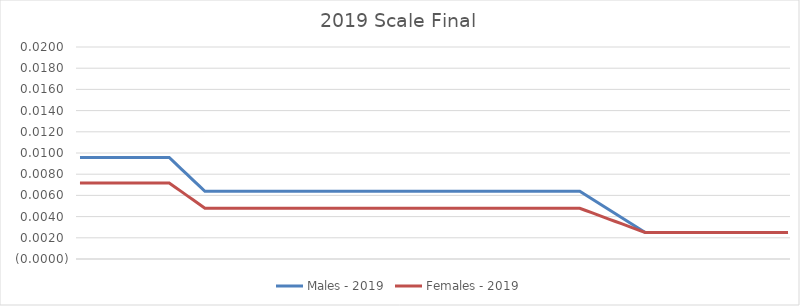
| Category |  Males - 2019  |  Females - 2019  |
|---|---|---|
|  | 0.01 | 0.007 |
|  | 0.01 | 0.007 |
|  | 0.01 | 0.007 |
|  | 0.01 | 0.007 |
|  | 0.01 | 0.007 |
|  | 0.01 | 0.007 |
|  | 0.01 | 0.007 |
|  | 0.01 | 0.007 |
|  | 0.01 | 0.007 |
|  | 0.01 | 0.007 |
|  | 0.01 | 0.007 |
|  | 0.01 | 0.007 |
|  | 0.01 | 0.007 |
|  | 0.01 | 0.007 |
|  | 0.01 | 0.007 |
|  | 0.01 | 0.007 |
|  | 0.009 | 0.007 |
|  | 0.009 | 0.006 |
|  | 0.008 | 0.006 |
|  | 0.007 | 0.006 |
|  | 0.007 | 0.005 |
|  | 0.006 | 0.005 |
|  | 0.006 | 0.005 |
|  | 0.006 | 0.005 |
|  | 0.006 | 0.005 |
|  | 0.006 | 0.005 |
|  | 0.006 | 0.005 |
|  | 0.006 | 0.005 |
|  | 0.006 | 0.005 |
|  | 0.006 | 0.005 |
|  | 0.006 | 0.005 |
|  | 0.006 | 0.005 |
|  | 0.006 | 0.005 |
|  | 0.006 | 0.005 |
|  | 0.006 | 0.005 |
|  | 0.006 | 0.005 |
|  | 0.006 | 0.005 |
|  | 0.006 | 0.005 |
|  | 0.006 | 0.005 |
|  | 0.006 | 0.005 |
|  | 0.006 | 0.005 |
|  | 0.006 | 0.005 |
|  | 0.006 | 0.005 |
|  | 0.006 | 0.005 |
|  | 0.006 | 0.005 |
|  | 0.006 | 0.005 |
|  | 0.006 | 0.005 |
|  | 0.006 | 0.005 |
|  | 0.006 | 0.005 |
|  | 0.006 | 0.005 |
|  | 0.006 | 0.005 |
|  | 0.006 | 0.005 |
|  | 0.006 | 0.005 |
|  | 0.006 | 0.005 |
|  | 0.006 | 0.005 |
|  | 0.006 | 0.005 |
|  | 0.006 | 0.005 |
|  | 0.006 | 0.005 |
|  | 0.006 | 0.005 |
|  | 0.006 | 0.005 |
|  | 0.006 | 0.005 |
|  | 0.006 | 0.005 |
|  | 0.006 | 0.005 |
|  | 0.006 | 0.005 |
|  | 0.006 | 0.005 |
|  | 0.006 | 0.005 |
|  | 0.006 | 0.005 |
|  | 0.006 | 0.005 |
|  | 0.006 | 0.005 |
|  | 0.006 | 0.005 |
|  | 0.006 | 0.005 |
|  | 0.006 | 0.005 |
|  | 0.006 | 0.005 |
|  | 0.006 | 0.005 |
|  | 0.006 | 0.005 |
|  | 0.006 | 0.005 |
|  | 0.006 | 0.005 |
|  | 0.006 | 0.005 |
|  | 0.006 | 0.005 |
|  | 0.006 | 0.005 |
|  | 0.006 | 0.005 |
|  | 0.006 | 0.005 |
|  | 0.006 | 0.005 |
|  | 0.006 | 0.005 |
|  | 0.006 | 0.005 |
|  | 0.006 | 0.005 |
|  | 0.006 | 0.004 |
|  | 0.005 | 0.004 |
|  | 0.005 | 0.004 |
|  | 0.005 | 0.004 |
|  | 0.004 | 0.004 |
|  | 0.004 | 0.003 |
|  | 0.004 | 0.003 |
|  | 0.003 | 0.003 |
|  | 0.003 | 0.003 |
|  | 0.002 | 0.002 |
|  | 0.002 | 0.002 |
|  | 0.002 | 0.002 |
|  | 0.002 | 0.002 |
|  | 0.002 | 0.002 |
|  | 0.002 | 0.002 |
|  | 0.002 | 0.002 |
|  | 0.002 | 0.002 |
|  | 0.002 | 0.002 |
|  | 0.002 | 0.002 |
|  | 0.002 | 0.002 |
|  | 0.002 | 0.002 |
|  | 0.002 | 0.002 |
|  | 0.002 | 0.002 |
|  | 0.002 | 0.002 |
|  | 0.002 | 0.002 |
|  | 0.002 | 0.002 |
|  | 0.002 | 0.002 |
|  | 0.002 | 0.002 |
|  | 0.002 | 0.002 |
|  | 0.002 | 0.002 |
|  | 0.002 | 0.002 |
|  | 0.002 | 0.002 |
|  | 0.002 | 0.002 |
|  | 0.002 | 0.002 |